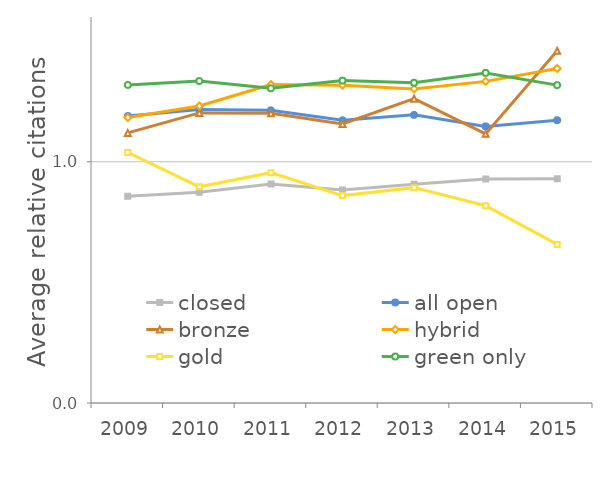
| Category | closed | all open | bronze | hybrid | gold | green only |
|---|---|---|---|---|---|---|
| 2009.0 | 0.857 | 1.19 | 1.119 | 1.183 | 1.039 | 1.318 |
| 2010.0 | 0.874 | 1.216 | 1.202 | 1.231 | 0.896 | 1.334 |
| 2011.0 | 0.908 | 1.213 | 1.201 | 1.32 | 0.955 | 1.304 |
| 2012.0 | 0.882 | 1.172 | 1.157 | 1.317 | 0.86 | 1.336 |
| 2013.0 | 0.907 | 1.194 | 1.262 | 1.302 | 0.893 | 1.327 |
| 2014.0 | 0.929 | 1.146 | 1.116 | 1.333 | 0.818 | 1.368 |
| 2015.0 | 0.93 | 1.172 | 1.46 | 1.387 | 0.657 | 1.318 |